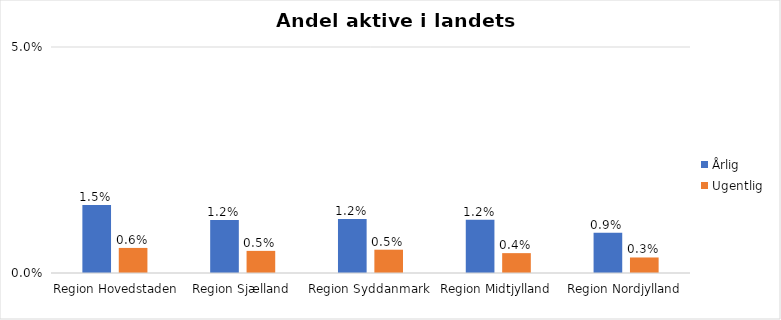
| Category | Årlig | Ugentlig |
|---|---|---|
| Region Hovedstaden | 0.015 | 0.006 |
| Region Sjælland | 0.012 | 0.005 |
| Region Syddanmark | 0.012 | 0.005 |
| Region Midtjylland | 0.012 | 0.004 |
| Region Nordjylland | 0.009 | 0.003 |